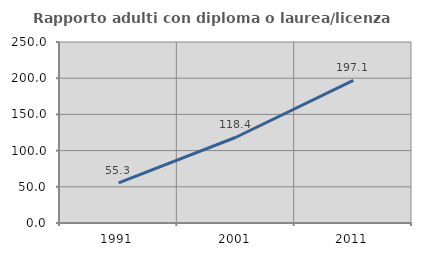
| Category | Rapporto adulti con diploma o laurea/licenza media  |
|---|---|
| 1991.0 | 55.31 |
| 2001.0 | 118.429 |
| 2011.0 | 197.065 |